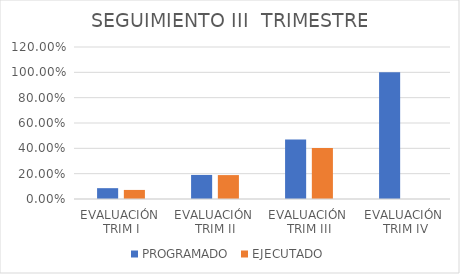
| Category | PROGRAMADO | EJECUTADO |
|---|---|---|
| EVALUACIÓN 
TRIM I | 0.086 | 0.072 |
| EVALUACIÓN 
TRIM II | 0.19 | 0.189 |
| EVALUACIÓN 
TRIM III | 0.471 | 0.402 |
| EVALUACIÓN
 TRIM IV | 1 | 0 |